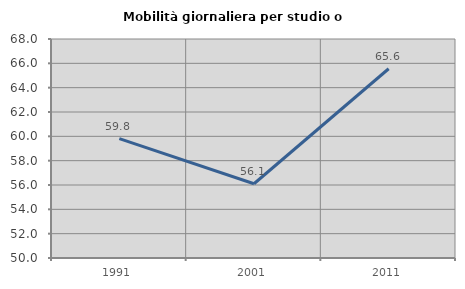
| Category | Mobilità giornaliera per studio o lavoro |
|---|---|
| 1991.0 | 59.812 |
| 2001.0 | 56.103 |
| 2011.0 | 65.556 |